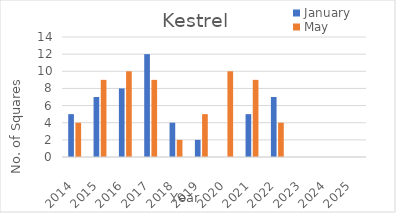
| Category | January | May |
|---|---|---|
| 2014.0 | 5 | 4 |
| 2015.0 | 7 | 9 |
| 2016.0 | 8 | 10 |
| 2017.0 | 12 | 9 |
| 2018.0 | 4 | 2 |
| 2019.0 | 2 | 5 |
| 2020.0 | 0 | 10 |
| 2021.0 | 5 | 9 |
| 2022.0 | 7 | 4 |
| 2023.0 | 0 | 0 |
| 2024.0 | 0 | 0 |
| 2025.0 | 0 | 0 |